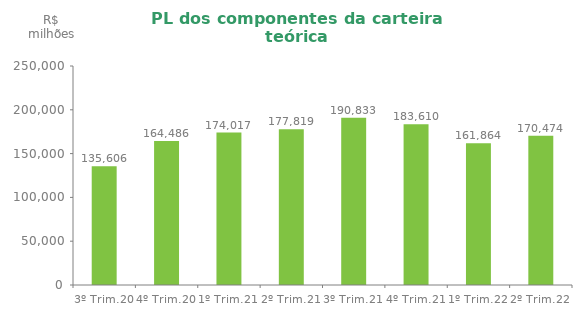
| Category | Series 0 |
|---|---|
| 3º Trim.20 | 135605.88 |
| 4º Trim.20 | 164486.25 |
| 1º Trim.21 | 174016.57 |
| 2º Trim.21 | 177819.2 |
| 3º Trim.21 | 190833.2 |
| 4º Trim.21 | 183610.486 |
| 1º Trim.22 | 161864.31 |
| 2º Trim.22 | 170474.192 |